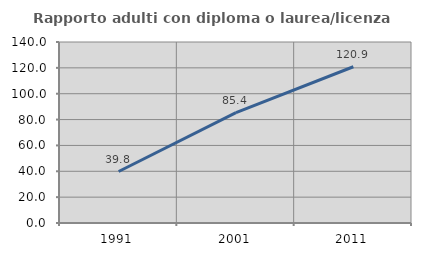
| Category | Rapporto adulti con diploma o laurea/licenza media  |
|---|---|
| 1991.0 | 39.832 |
| 2001.0 | 85.406 |
| 2011.0 | 120.866 |